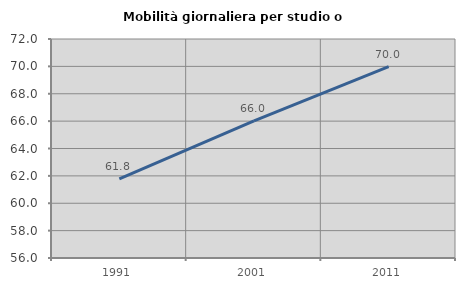
| Category | Mobilità giornaliera per studio o lavoro |
|---|---|
| 1991.0 | 61.789 |
| 2001.0 | 66.019 |
| 2011.0 | 69.981 |